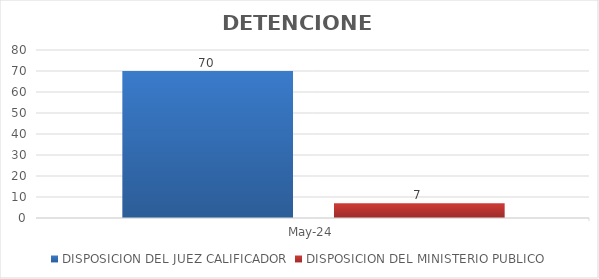
| Category | DISPOSICION DEL JUEZ CALIFICADOR | DISPOSICION DEL MINISTERIO PUBLICO |
|---|---|---|
| 2024-05-01 | 70 | 7 |